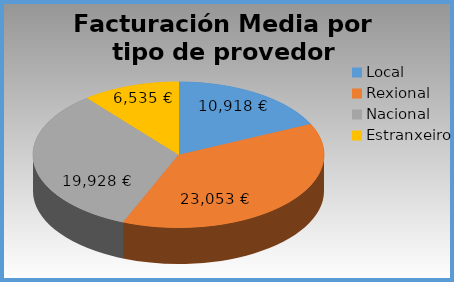
| Category | Facturación Media por tipo de provedor |
|---|---|
| Local | 10918.157 |
| Rexional | 23053.05 |
| Nacional | 19927.979 |
| Estranxeiro | 6534.682 |